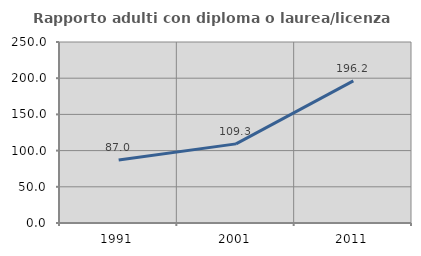
| Category | Rapporto adulti con diploma o laurea/licenza media  |
|---|---|
| 1991.0 | 87.006 |
| 2001.0 | 109.292 |
| 2011.0 | 196.216 |